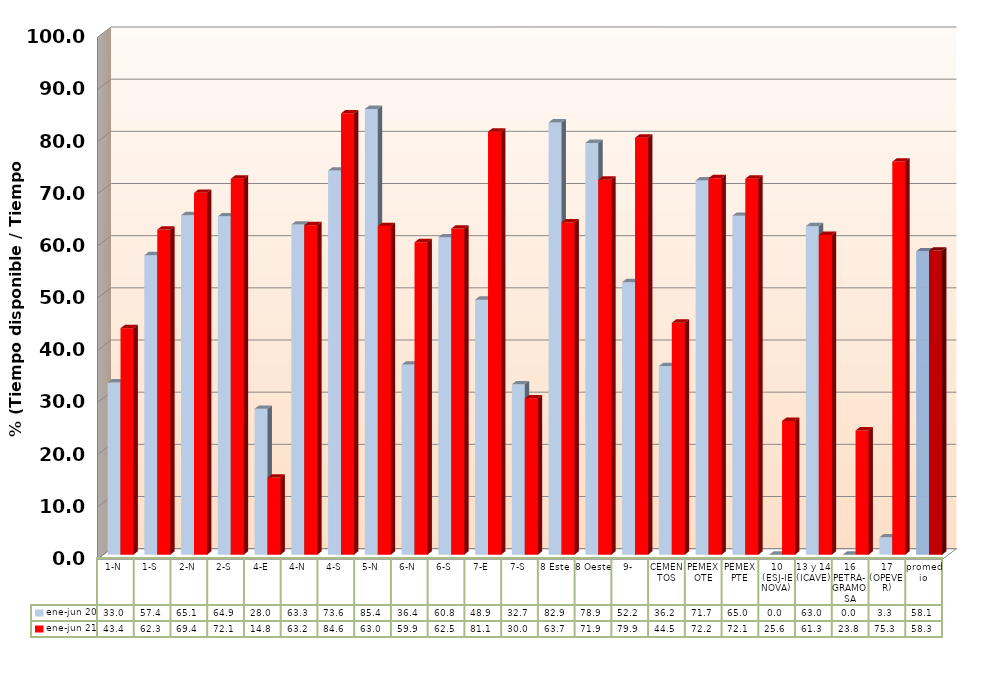
| Category | ene-jun 20 | ene-jun 21 |
|---|---|---|
| 1-N | 33.017 | 43.414 |
| 1-S | 57.409 | 62.317 |
| 2-N | 65.07 | 69.37 |
| 2-S | 64.852 | 72.066 |
| 4-E | 27.964 | 14.785 |
| 4-N | 63.277 | 63.152 |
| 4-S | 73.636 | 84.611 |
| 5-N | 85.448 | 62.99 |
| 6-N | 36.437 | 59.893 |
| 6-S | 60.849 | 62.526 |
| 7-E | 48.879 | 81.086 |
| 7-S | 32.657 | 29.982 |
| 8 Este | 82.865 | 63.713 |
| 8 Oeste | 78.935 | 71.888 |
| 9- | 52.241 | 79.929 |
| CEMENTOS | 36.151 | 44.479 |
| PEMEX OTE | 71.748 | 72.171 |
| PEMEX PTE | 64.953 | 72.08 |
| 10 (ESJ-IENOVA) | 0 | 25.636 |
| 13 y 14 (ICAVE) | 62.976 | 61.284 |
| 16 PETRA-GRAMOSA | 0 | 23.82 |
| 17 (OPEVER) | 3.333 | 75.344 |
| promedio | 58.148 | 58.305 |